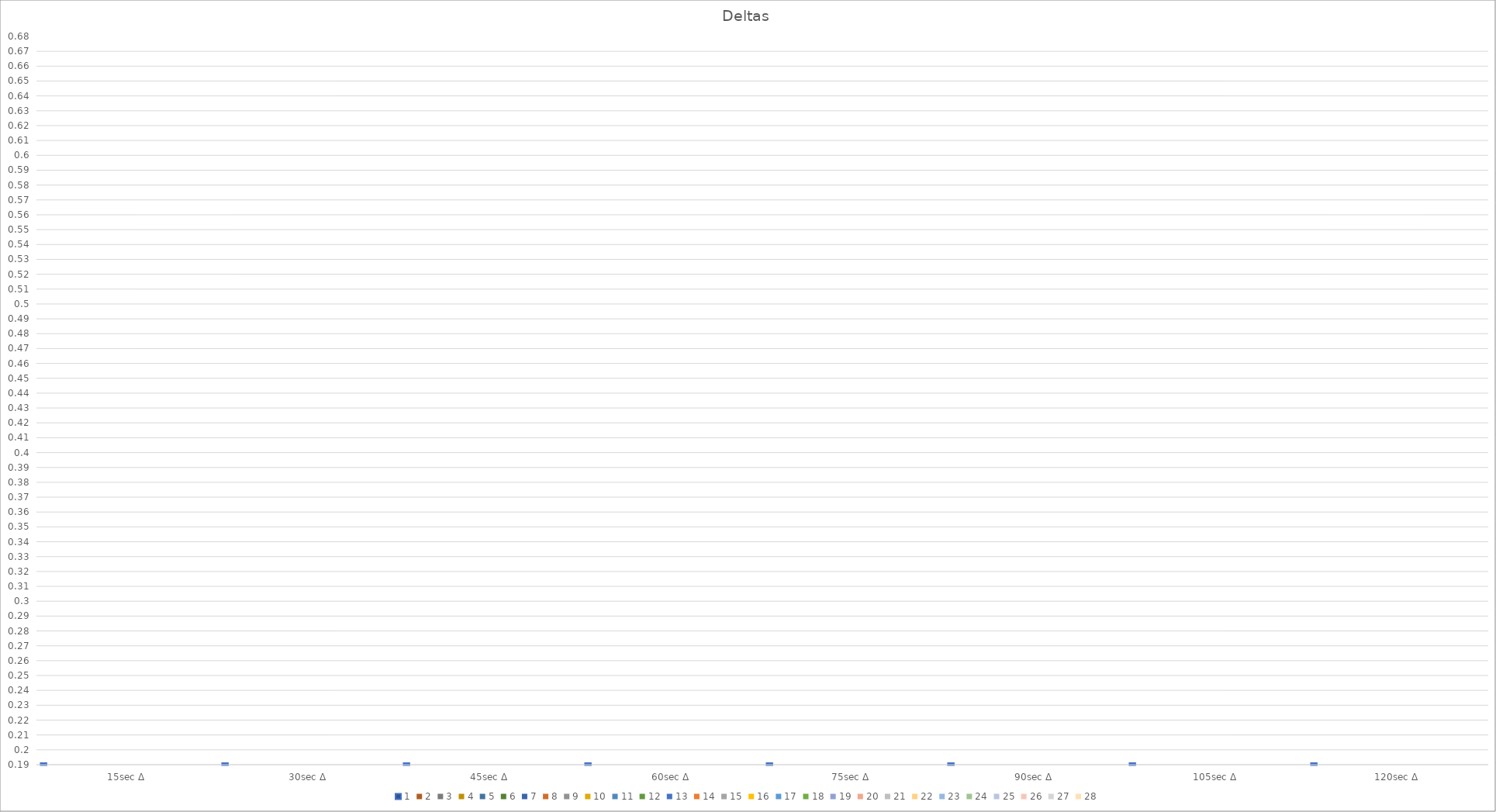
| Category | 1 | 2 | 3 | 4 | 5 | 6 | 7 | 8 | 9 | 10 | 11 | 12 | 13 | 14 | 15 | 16 | 17 | 18 | 19 | 20 | 21 | 22 | 23 | 24 | 25 | 26 | 27 | 28 |
|---|---|---|---|---|---|---|---|---|---|---|---|---|---|---|---|---|---|---|---|---|---|---|---|---|---|---|---|---|
| 15sec Δ | 0 | 0 | 0 | 0 | 0 | 0 | 0 | 0 | 0 | 0 | 0 | 0 | 0 | 0 | 0 | 0 | 0 | 0 | 0 | 0 | 0 | 0 | 0 | 0 | 0 | 0 | 0 | 0 |
| 30sec Δ | 0 | 0 | 0 | 0 | 0 | 0 | 0 | 0 | 0 | 0 | 0 | 0 | 0 | 0 | 0 | 0 | 0 | 0 | 0 | 0 | 0 | 0 | 0 | 0 | 0 | 0 | 0 | 0 |
| 45sec Δ | 0 | 0 | 0 | 0 | 0 | 0 | 0 | 0 | 0 | 0 | 0 | 0 | 0 | 0 | 0 | 0 | 0 | 0 | 0 | 0 | 0 | 0 | 0 | 0 | 0 | 0 | 0 | 0 |
| 60sec Δ | 0 | 0 | 0 | 0 | 0 | 0 | 0 | 0 | 0 | 0 | 0 | 0 | 0 | 0 | 0 | 0 | 0 | 0 | 0 | 0 | 0 | 0 | 0 | 0 | 0 | 0 | 0 | 0 |
| 75sec Δ  | 0 | 0 | 0 | 0 | 0 | 0 | 0 | 0 | 0 | 0 | 0 | 0 | 0 | 0 | 0 | 0 | 0 | 0 | 0 | 0 | 0 | 0 | 0 | 0 | 0 | 0 | 0 | 0 |
| 90sec Δ | 0 | 0 | 0 | 0 | 0 | 0 | 0 | 0 | 0 | 0 | 0 | 0 | 0 | 0 | 0 | 0 | 0 | 0 | 0 | 0 | 0 | 0 | 0 | 0 | 0 | 0 | 0 | 0 |
| 105sec Δ | 0 | 0 | 0 | 0 | 0 | 0 | 0 | 0 | 0 | 0 | 0 | 0 | 0 | 0 | 0 | 0 | 0 | 0 | 0 | 0 | 0 | 0 | 0 | 0 | 0 | 0 | 0 | 0 |
| 120sec Δ | 0 | 0 | 0 | 0 | 0 | 0 | 0 | 0 | 0 | 0 | 0 | 0 | 0 | 0 | 0 | 0 | 0 | 0 | 0 | 0 | 0 | 0 | 0 | 0 | 0 | 0 | 0 | 0 |